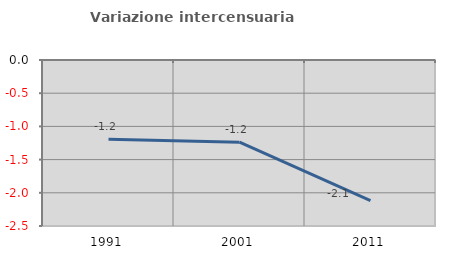
| Category | Variazione intercensuaria annua |
|---|---|
| 1991.0 | -1.194 |
| 2001.0 | -1.237 |
| 2011.0 | -2.119 |